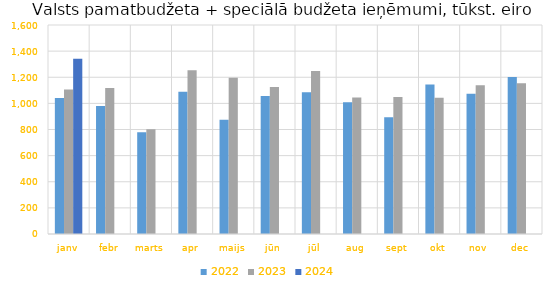
| Category | 2022 | 2023 | 2024 |
|---|---|---|---|
| janv | 1040582.151 | 1106694.936 | 1340794.093 |
| febr | 979083.527 | 1117281.777 | 0 |
| marts | 778451.361 | 802572.118 | 0 |
| apr | 1089522.586 | 1254540.122 | 0 |
| maijs | 873781.393 | 1197075.215 | 0 |
| jūn | 1056226.576 | 1125656.105 | 0 |
| jūl | 1084656.571 | 1247090.946 | 0 |
| aug | 1009449.844 | 1044839.258 | 0 |
| sept | 894284.855 | 1048693.583 | 0 |
| okt | 1144151.024 | 1042398.987 | 0 |
| nov | 1072959.66 | 1138266.556 | 0 |
| dec | 1201924.058 | 1154996.585 | 0 |